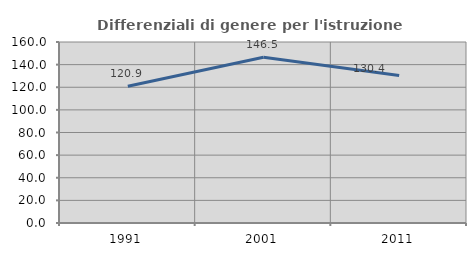
| Category | Differenziali di genere per l'istruzione superiore |
|---|---|
| 1991.0 | 120.906 |
| 2001.0 | 146.472 |
| 2011.0 | 130.392 |